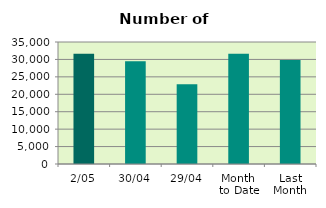
| Category | Series 0 |
|---|---|
| 2/05 | 31628 |
| 30/04 | 29468 |
| 29/04 | 22880 |
| Month 
to Date | 31628 |
| Last
Month | 29833 |